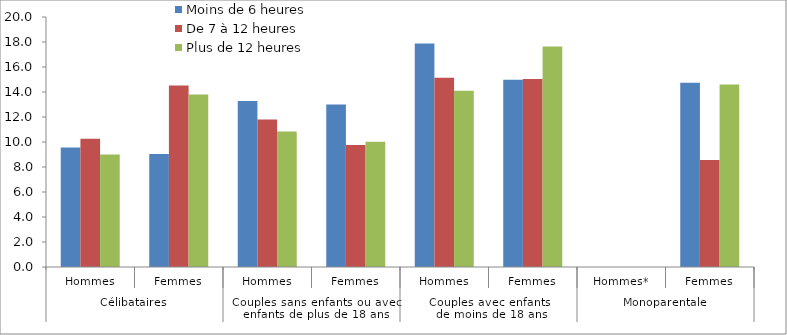
| Category | Moins de 6 heures | De 7 à 12 heures | Plus de 12 heures |
|---|---|---|---|
| 0 | 9.56 | 10.26 | 9 |
| 1 | 9.04 | 14.52 | 13.81 |
| 2 | 13.29 | 11.81 | 10.85 |
| 3 | 13 | 9.77 | 10.02 |
| 4 | 17.89 | 15.15 | 14.11 |
| 5 | 14.99 | 15.04 | 17.64 |
| 6 | 0 | 0 | 0 |
| 7 | 14.75 | 8.57 | 14.6 |